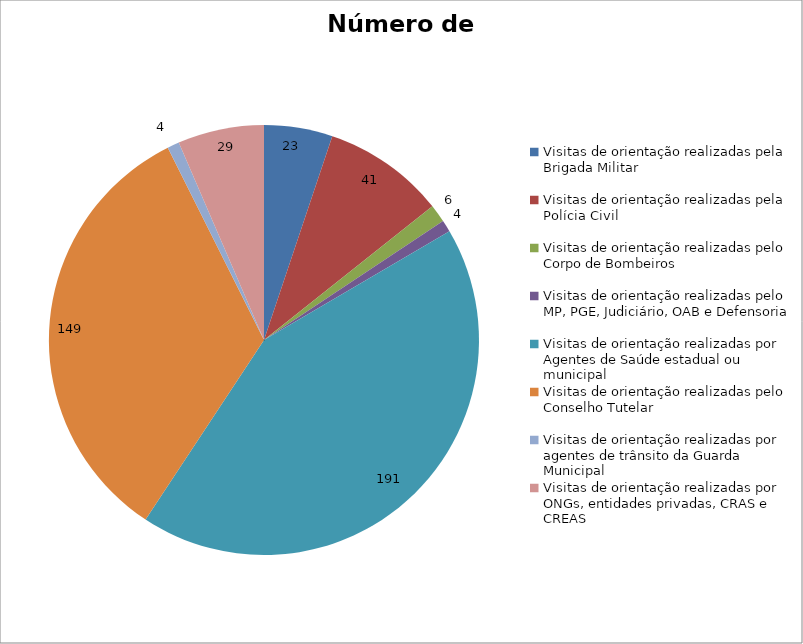
| Category | Número de Ações |
|---|---|
| Visitas de orientação realizadas pela Brigada Militar | 23 |
| Visitas de orientação realizadas pela Polícia Civil | 41 |
| Visitas de orientação realizadas pelo Corpo de Bombeiros | 6 |
| Visitas de orientação realizadas pelo MP, PGE, Judiciário, OAB e Defensoria | 4 |
| Visitas de orientação realizadas por Agentes de Saúde estadual ou municipal | 191 |
| Visitas de orientação realizadas pelo Conselho Tutelar | 149 |
| Visitas de orientação realizadas por agentes de trânsito da Guarda Municipal | 4 |
| Visitas de orientação realizadas por ONGs, entidades privadas, CRAS e CREAS | 29 |